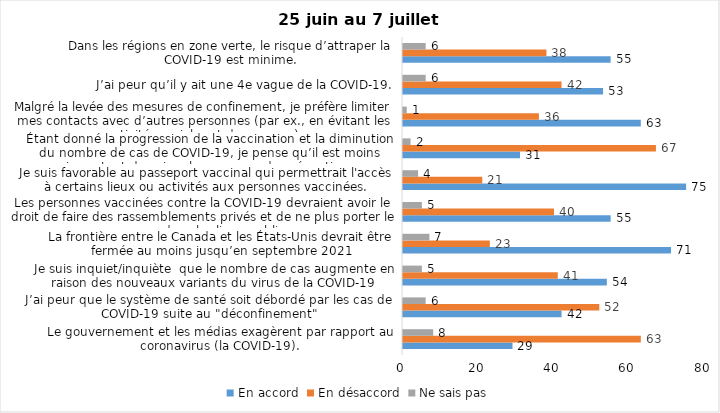
| Category | En accord | En désaccord | Ne sais pas |
|---|---|---|---|
| Le gouvernement et les médias exagèrent par rapport au coronavirus (la COVID-19). | 29 | 63 | 8 |
| J’ai peur que le système de santé soit débordé par les cas de COVID-19 suite au "déconfinement" | 42 | 52 | 6 |
| Je suis inquiet/inquiète  que le nombre de cas augmente en raison des nouveaux variants du virus de la COVID-19 | 54 | 41 | 5 |
| La frontière entre le Canada et les États-Unis devrait être fermée au moins jusqu’en septembre 2021 | 71 | 23 | 7 |
| Les personnes vaccinées contre la COVID-19 devraient avoir le droit de faire des rassemblements privés et de ne plus porter le masque dans les lieux publics. | 55 | 40 | 5 |
| Je suis favorable au passeport vaccinal qui permettrait l'accès à certains lieux ou activités aux personnes vaccinées. | 75 | 21 | 4 |
| Étant donné la progression de la vaccination et la diminution du nombre de cas de COVID-19, je pense qu’il est moins important de suivre les mesures de prévention. | 31 | 67 | 2 |
| Malgré la levée des mesures de confinement, je préfère limiter mes contacts avec d’autres personnes (par ex., en évitant les activités sociales et de groupes) | 63 | 36 | 1 |
| J’ai peur qu’il y ait une 4e vague de la COVID-19. | 53 | 42 | 6 |
| Dans les régions en zone verte, le risque d’attraper la COVID-19 est minime. | 55 | 38 | 6 |